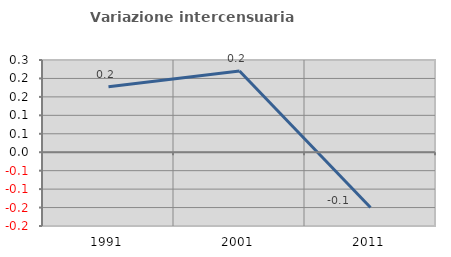
| Category | Variazione intercensuaria annua |
|---|---|
| 1991.0 | 0.177 |
| 2001.0 | 0.22 |
| 2011.0 | -0.15 |